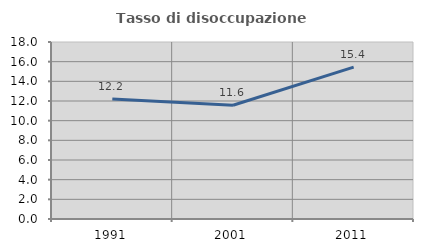
| Category | Tasso di disoccupazione giovanile  |
|---|---|
| 1991.0 | 12.207 |
| 2001.0 | 11.565 |
| 2011.0 | 15.447 |